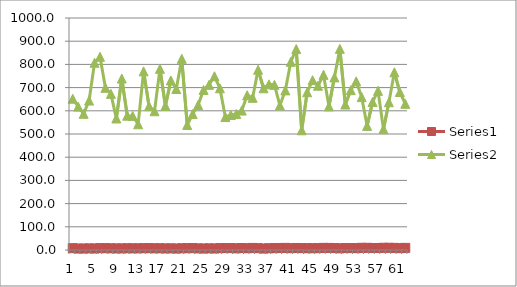
| Category | Series 1 | Series 2 |
|---|---|---|
| 0 | 7.9 | 652 |
| 1 | 6.3 | 618 |
| 2 | 6.5 | 587 |
| 3 | 7 | 644 |
| 4 | 6.4 | 807 |
| 5 | 7.9 | 833 |
| 6 | 8 | 699 |
| 7 | 7.3 | 673 |
| 8 | 6.9 | 567 |
| 9 | 6.9 | 739 |
| 10 | 7.5 | 579 |
| 11 | 7.2 | 578 |
| 12 | 7.2 | 542 |
| 13 | 8 | 770 |
| 14 | 8 | 620 |
| 15 | 7.3 | 598 |
| 16 | 7.6 | 781 |
| 17 | 6.8 | 621 |
| 18 | 7.2 | 731 |
| 19 | 6.3 | 694 |
| 20 | 7.5 | 824 |
| 21 | 7.8 | 539 |
| 22 | 8.2 | 586 |
| 23 | 7 | 625 |
| 24 | 6.5 | 690 |
| 25 | 7.2 | 712 |
| 26 | 6.6 | 749 |
| 27 | 8 | 697 |
| 28 | 8.4 | 573 |
| 29 | 8.4 | 582 |
| 30 | 7.2 | 586 |
| 31 | 8.6 | 601 |
| 32 | 7.6 | 667 |
| 33 | 8.9 | 656 |
| 34 | 7.9 | 777 |
| 35 | 6.3 | 697 |
| 36 | 7.6 | 714 |
| 37 | 8.2 | 712 |
| 38 | 8.4 | 623 |
| 39 | 9.1 | 688 |
| 40 | 7.8 | 811 |
| 41 | 8.7 | 866 |
| 42 | 8.2 | 516 |
| 43 | 7.8 | 680 |
| 44 | 7.7 | 732 |
| 45 | 8.2 | 708 |
| 46 | 9.1 | 755 |
| 47 | 8.9 | 619 |
| 48 | 8.4 | 744 |
| 49 | 7.2 | 867 |
| 50 | 8.5 | 627 |
| 51 | 8.3 | 689 |
| 52 | 7.9 | 727 |
| 53 | 9.4 | 659 |
| 54 | 9.4 | 535 |
| 55 | 8.7 | 638 |
| 56 | 8.6 | 686 |
| 57 | 9.6 | 521 |
| 58 | 9.5 | 637 |
| 59 | 9.1 | 766 |
| 60 | 8 | 681 |
| 61 | 9.2 | 630 |